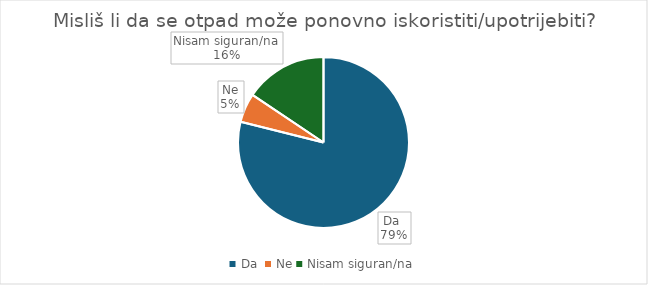
| Category | Series 0 |
|---|---|
| Da  | 86 |
| Ne | 6 |
| Nisam siguran/na | 17 |